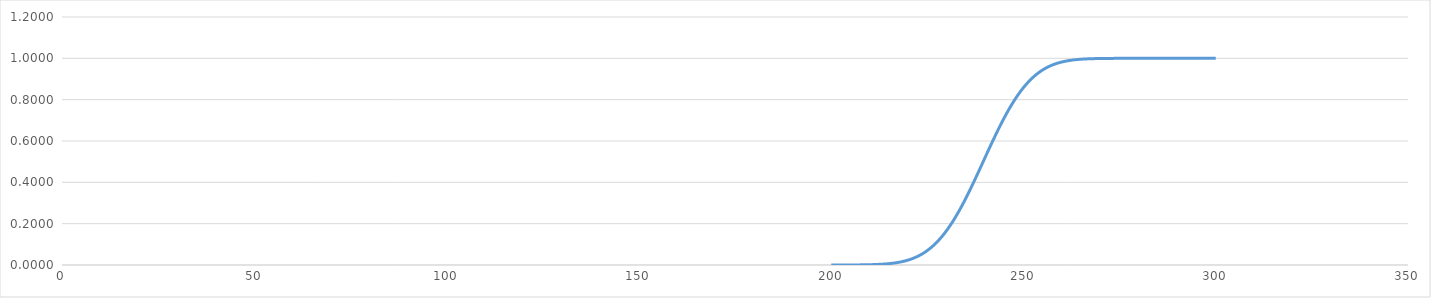
| Category | Series 0 |
|---|---|
| 200.0 | 0 |
| 201.0 | 0 |
| 202.0 | 0 |
| 203.0 | 0 |
| 204.0 | 0 |
| 205.0 | 0 |
| 206.0 | 0 |
| 207.0 | 0.001 |
| 208.0 | 0.001 |
| 209.0 | 0.001 |
| 210.0 | 0.001 |
| 211.0 | 0.002 |
| 212.0 | 0.003 |
| 213.0 | 0.004 |
| 214.0 | 0.005 |
| 215.0 | 0.006 |
| 216.0 | 0.009 |
| 217.0 | 0.011 |
| 218.0 | 0.015 |
| 219.0 | 0.019 |
| 220.0 | 0.024 |
| 221.0 | 0.03 |
| 222.0 | 0.038 |
| 223.0 | 0.047 |
| 224.0 | 0.057 |
| 225.0 | 0.07 |
| 226.0 | 0.085 |
| 227.0 | 0.101 |
| 228.0 | 0.12 |
| 229.0 | 0.142 |
| 230.0 | 0.166 |
| 231.0 | 0.193 |
| 232.0 | 0.222 |
| 233.0 | 0.253 |
| 234.0 | 0.287 |
| 235.0 | 0.322 |
| 236.0 | 0.359 |
| 237.0 | 0.398 |
| 238.0 | 0.438 |
| 239.0 | 0.478 |
| 240.0 | 0.519 |
| 241.0 | 0.56 |
| 242.0 | 0.599 |
| 243.0 | 0.638 |
| 244.0 | 0.676 |
| 245.0 | 0.712 |
| 246.0 | 0.746 |
| 247.0 | 0.778 |
| 248.0 | 0.807 |
| 249.0 | 0.834 |
| 250.0 | 0.858 |
| 251.0 | 0.88 |
| 252.0 | 0.899 |
| 253.0 | 0.916 |
| 254.0 | 0.931 |
| 255.0 | 0.944 |
| 256.0 | 0.955 |
| 257.0 | 0.964 |
| 258.0 | 0.971 |
| 259.0 | 0.977 |
| 260.0 | 0.982 |
| 261.0 | 0.986 |
| 262.0 | 0.99 |
| 263.0 | 0.992 |
| 264.0 | 0.994 |
| 265.0 | 0.996 |
| 266.0 | 0.997 |
| 267.0 | 0.998 |
| 268.0 | 0.998 |
| 269.0 | 0.999 |
| 270.0 | 0.999 |
| 271.0 | 0.999 |
| 272.0 | 1 |
| 273.0 | 1 |
| 274.0 | 1 |
| 275.0 | 1 |
| 276.0 | 1 |
| 277.0 | 1 |
| 278.0 | 1 |
| 279.0 | 1 |
| 280.0 | 1 |
| 281.0 | 1 |
| 282.0 | 1 |
| 283.0 | 1 |
| 284.0 | 1 |
| 285.0 | 1 |
| 286.0 | 1 |
| 287.0 | 1 |
| 288.0 | 1 |
| 289.0 | 1 |
| 290.0 | 1 |
| 291.0 | 1 |
| 292.0 | 1 |
| 293.0 | 1 |
| 294.0 | 1 |
| 295.0 | 1 |
| 296.0 | 1 |
| 297.0 | 1 |
| 298.0 | 1 |
| 299.0 | 1 |
| 300.0 | 1 |